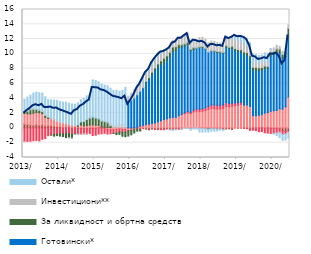
| Category | По трансакционим рачунима | Стамбени | Потрошачки | Готовински* | За ликвидност и обртна средства** | Инвестициони** | Остали* |
|---|---|---|---|---|---|---|---|
| 2013-01-01 | 0.508 | 1.431 | -1.847 | 0 | 0.247 | -0.025 | 1.661 |
| 2013-02-01 | 0.453 | 1.445 | -1.828 | 0 | 0.347 | 0.059 | 1.858 |
| 2013-03-01 | 0.396 | 1.481 | -1.809 | 0 | 0.577 | 0.174 | 1.791 |
| 2013-04-01 | 0.363 | 1.611 | -1.729 | 0 | 0.524 | 0.158 | 2.057 |
| 2013-05-01 | 0.428 | 1.629 | -1.697 | 0 | 0.421 | 0.119 | 2.236 |
| 2013-06-01 | 0.354 | 1.679 | -1.76 | 0 | 0.356 | 0.073 | 2.298 |
| 2013-07-01 | 0.377 | 1.547 | -1.534 | 0 | 0.28 | 0.055 | 2.445 |
| 2013-08-01 | 0.277 | 1.122 | -1.451 | 0 | 0.273 | 0.107 | 2.436 |
| 2013-09-01 | 0.283 | 0.981 | -1.058 | 0 | 0.173 | 0.116 | 2.267 |
| 2013-10-01 | 0.296 | 0.993 | -0.949 | 0 | -0.033 | 0.081 | 2.425 |
| 2013-11-01 | 0.234 | 0.883 | -0.898 | 0 | -0.218 | 0.069 | 2.571 |
| 2013-12-01 | 0.178 | 0.692 | -0.843 | 0 | -0.202 | 0.115 | 2.751 |
| 2014-01-01 | 0.161 | 0.59 | -0.827 | 0 | -0.283 | 0.112 | 2.704 |
| 2014-02-01 | 0.047 | 0.58 | -0.791 | 0 | -0.379 | 0.1 | 2.763 |
| 2014-03-01 | 0.093 | 0.545 | -0.742 | 0 | -0.569 | 0.016 | 2.827 |
| 2014-04-01 | 0.086 | 0.425 | -0.769 | 0 | -0.554 | -0.011 | 2.841 |
| 2014-05-01 | -0.103 | 0.39 | -0.777 | 0 | -0.503 | -0.016 | 2.846 |
| 2014-06-01 | 0.02 | 0.27 | -0.77 | 0 | -0.102 | -0.004 | 2.917 |
| 2014-07-01 | -0.1 | 0.167 | -0.769 | 0 | 0.237 | -0.031 | 2.979 |
| 2014-08-01 | -0.098 | 0.395 | -0.748 | 0 | 0.414 | -0.032 | 3.01 |
| 2014-09-01 | -0.081 | 0.267 | -0.729 | 0 | 0.594 | -0.055 | 3.145 |
| 2014-10-01 | -0.149 | 0.302 | -0.669 | 0 | 0.817 | -0.022 | 3.213 |
| 2014-11-01 | -0.14 | 0.382 | -0.636 | 0 | 0.945 | 0.036 | 3.176 |
| 2014-12-01 | -0.096 | 0.404 | -0.93 | 0 | 1.047 | 0.02 | 5.023 |
| 2015-01-01 | -0.103 | 0.371 | -0.88 | 0 | 0.971 | 0.029 | 5.041 |
| 2015-02-01 | 0.049 | 0.294 | -0.837 | 0 | 0.885 | 0.01 | 4.996 |
| 2015-03-01 | 0.079 | 0.039 | -0.79 | 0 | 0.818 | 0.043 | 4.945 |
| 2015-04-01 | 0.097 | -0.029 | -0.7 | 0 | 0.733 | 0.112 | 4.846 |
| 2015-05-01 | 0.037 | -0.211 | -0.623 | 0 | 0.663 | 0.156 | 4.828 |
| 2015-06-01 | 0.048 | -0.237 | -0.564 | 0 | 0.273 | 0.217 | 4.827 |
| 2015-07-01 | 0.011 | -0.222 | -0.512 | 0 | -0.03 | 0.258 | 4.777 |
| 2015-08-01 | 0.06 | -0.235 | -0.472 | 0 | -0.202 | 0.254 | 4.784 |
| 2015-09-01 | -0.027 | -0.077 | -0.415 | 0 | -0.356 | 0.321 | 4.643 |
| 2015-10-01 | -0.034 | -0.17 | -0.385 | 0 | -0.533 | 0.409 | 4.662 |
| 2015-11-01 | 0.008 | -0.216 | -0.356 | 0 | -0.624 | 0.491 | 4.982 |
| 2015-12-01 | -0.089 | -0.265 | -0.024 | 3.632 | -0.722 | 0.632 | 0.016 |
| 2016-01-01 | -0.127 | -0.175 | -0.021 | 3.762 | -0.611 | 0.682 | 0.257 |
| 2016-02-01 | -0.043 | -0.189 | 0.001 | 4.013 | -0.457 | 0.748 | 0.372 |
| 2016-03-01 | -0.152 | 0.065 | 0.042 | 4.376 | -0.299 | 0.899 | 0.433 |
| 2016-04-01 | -0.291 | 0.194 | 0.05 | 4.714 | -0.12 | 0.918 | 0.433 |
| 2016-05-01 | -0.108 | 0.303 | 0.059 | 5.046 | 0.031 | 0.954 | 0.425 |
| 2016-06-01 | -0.176 | 0.432 | 0.056 | 5.656 | 0.139 | 0.962 | 0.437 |
| 2016-07-01 | -0.255 | 0.503 | 0.03 | 6.024 | 0.239 | 0.947 | 0.404 |
| 2016-08-01 | -0.154 | 0.606 | 0.004 | 6.623 | 0.307 | 0.957 | 0.426 |
| 2016-09-01 | -0.178 | 0.661 | -0.02 | 7.102 | 0.348 | 1.031 | 0.396 |
| 2016-10-01 | -0.176 | 0.793 | -0.055 | 7.461 | 0.394 | 1.006 | 0.414 |
| 2016-11-01 | -0.174 | 0.952 | -0.065 | 7.609 | 0.499 | 0.969 | 0.433 |
| 2016-12-01 | -0.201 | 1.131 | -0.045 | 7.685 | 0.596 | 0.886 | 0.263 |
| 2017-01-01 | -0.106 | 1.22 | -0.024 | 7.92 | 0.595 | 0.87 | 0.053 |
| 2017-02-01 | -0.207 | 1.343 | -0.03 | 8.279 | 0.584 | 0.861 | -0.029 |
| 2017-03-01 | -0.208 | 1.424 | -0.041 | 8.897 | 0.588 | 0.894 | -0.087 |
| 2017-04-01 | -0.152 | 1.419 | -0.038 | 9.037 | 0.509 | 0.925 | -0.101 |
| 2017-05-01 | -0.139 | 1.617 | -0.009 | 9.239 | 0.4 | 0.979 | 0.036 |
| 2017-06-01 | -0.149 | 1.807 | 0.026 | 9.09 | 0.33 | 1.082 | -0.071 |
| 2017-07-01 | -0.013 | 1.938 | 0.095 | 9.039 | 0.286 | 1.153 | -0.047 |
| 2017-08-01 | -0.026 | 2.037 | 0.187 | 9.028 | 0.319 | 1.239 | -0.048 |
| 2017-09-01 | -0.096 | 1.953 | 0.144 | 8.311 | 0.208 | 1.123 | -0.228 |
| 2017-10-01 | -0.014 | 2.157 | 0.238 | 8.209 | 0.241 | 1.163 | -0.142 |
| 2017-11-01 | -0.023 | 2.254 | 0.303 | 8.195 | 0.045 | 1.16 | -0.142 |
| 2017-12-01 | -0.056 | 2.205 | 0.311 | 8.33 | 0.09 | 1.26 | -0.508 |
| 2018-01-01 | -0.081 | 2.265 | 0.327 | 8.3 | 0.083 | 1.278 | -0.481 |
| 2018-02-01 | -0.113 | 2.34 | 0.369 | 7.965 | 0.047 | 1.301 | -0.424 |
| 2018-03-01 | -0.111 | 2.495 | 0.416 | 7.335 | -0.033 | 1.25 | -0.433 |
| 2018-04-01 | -0.081 | 2.649 | 0.463 | 7.33 | -0.002 | 1.282 | -0.359 |
| 2018-05-01 | -0.115 | 2.601 | 0.491 | 7.248 | 0.078 | 1.279 | -0.329 |
| 2018-06-01 | -0.166 | 2.547 | 0.505 | 7.138 | 0.143 | 1.197 | -0.261 |
| 2018-07-01 | -0.145 | 2.554 | 0.495 | 7.101 | 0.124 | 1.2 | -0.178 |
| 2018-08-01 | -0.225 | 2.647 | 0.474 | 6.992 | 0.092 | 1.178 | -0.137 |
| 2018-09-01 | -0.14 | 2.915 | 0.498 | 7.489 | 0.205 | 1.226 | 0.07 |
| 2018-10-01 | -0.125 | 2.846 | 0.442 | 7.456 | 0.158 | 1.193 | 0.104 |
| 2018-11-01 | -0.206 | 2.929 | 0.385 | 7.416 | 0.306 | 1.244 | 0.165 |
| 2018-12-01 | -0.005 | 3.009 | 0.366 | 7.096 | 0.257 | 1.224 | 0.559 |
| 2019-01-01 | -0.045 | 3.078 | 0.343 | 6.898 | 0.267 | 1.186 | 0.594 |
| 2019-02-01 | -0.024 | 3.175 | 0.284 | 6.823 | 0.273 | 1.178 | 0.658 |
| 2019-03-01 | -0.041 | 3.067 | -0.017 | 6.909 | 0.281 | 1.148 | 0.909 |
| 2019-04-01 | -0.041 | 3.102 | -0.071 | 6.728 | 0.35 | 0.959 | 0.944 |
| 2019-05-01 | -0.101 | 2.892 | -0.229 | 6.532 | 0.332 | 0.851 | 0.917 |
| 2019-06-01 | -0.032 | 1.641 | -0.277 | 6.225 | 0.324 | 0.815 | 0.995 |
| 2019-07-01 | -0.025 | 1.64 | -0.34 | 6.167 | 0.367 | 0.718 | 1.061 |
| 2019-08-01 | -0.025 | 1.693 | -0.499 | 6.043 | 0.38 | 0.64 | 1.02 |
| 2019-09-01 | 0.002 | 1.775 | -0.51 | 6.049 | 0.332 | 0.612 | 1.07 |
| 2019-10-01 | -0.05 | 1.982 | -0.601 | 6.001 | 0.376 | 0.64 | 1.136 |
| 2019-11-01 | 0.007 | 2.063 | -0.707 | 6.01 | 0.22 | 0.687 | 1.091 |
| 2019-12-01 | -0.045 | 2.247 | -0.705 | 7.459 | 0.31 | 0.604 | 0.11 |
| 2020-01-31 | -0.067 | 2.32 | -0.682 | 7.598 | 0.358 | 0.543 | -0.106 |
| 2020-02-29 | -0.05 | 2.357 | -0.646 | 7.878 | 0.431 | 0.481 | -0.343 |
| 2020-03-31 | -0.142 | 2.559 | -0.469 | 7.592 | 0.497 | 0.362 | -0.692 |
| 2020-04-30 | -0.391 | 2.519 | -0.482 | 6.976 | 0.428 | 0.428 | -0.806 |
| 2020-05-31 | -0.497 | 2.845 | -0.315 | 6.823 | 0.636 | 0.451 | -0.835 |
| 2020-06-30 | -0.368 | 4.188 | -0.212 | 7.993 | 1.298 | 0.472 | -0.813 |